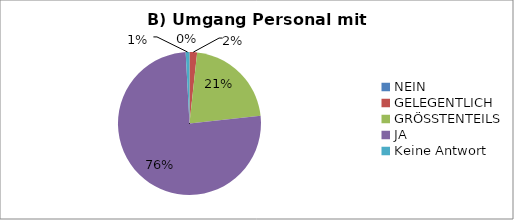
| Category | Series 0 |
|---|---|
| NEIN | 0 |
| GELEGENTLICH | 8 |
| GRÖSSTENTEILS | 101 |
| JA | 355 |
| Keine Antwort | 4 |